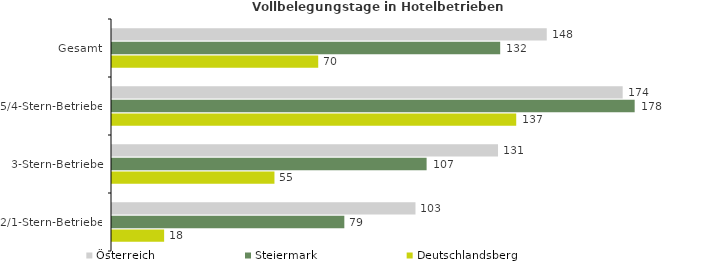
| Category | Österreich | Steiermark | Deutschlandsberg |
|---|---|---|---|
| Gesamt | 147.876 | 132.038 | 70.143 |
| 5/4-Stern-Betriebe | 173.697 | 177.779 | 137.49 |
| 3-Stern-Betriebe | 131.294 | 107.011 | 55.257 |
| 2/1-Stern-Betriebe | 103.222 | 79.024 | 17.733 |